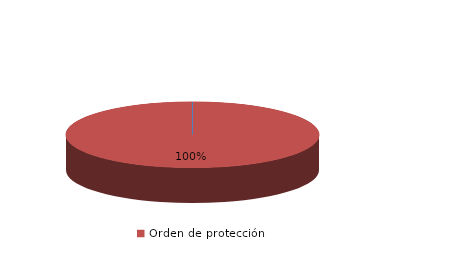
| Category | Series 0 |
|---|---|
| Orden de alejamiento | 0 |
| Orden de protección | 14 |